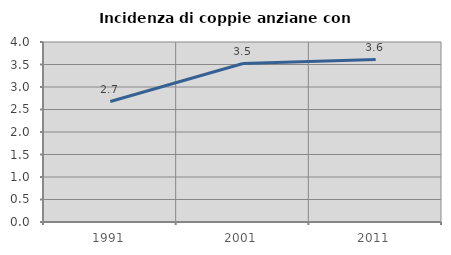
| Category | Incidenza di coppie anziane con figli |
|---|---|
| 1991.0 | 2.677 |
| 2001.0 | 3.521 |
| 2011.0 | 3.609 |